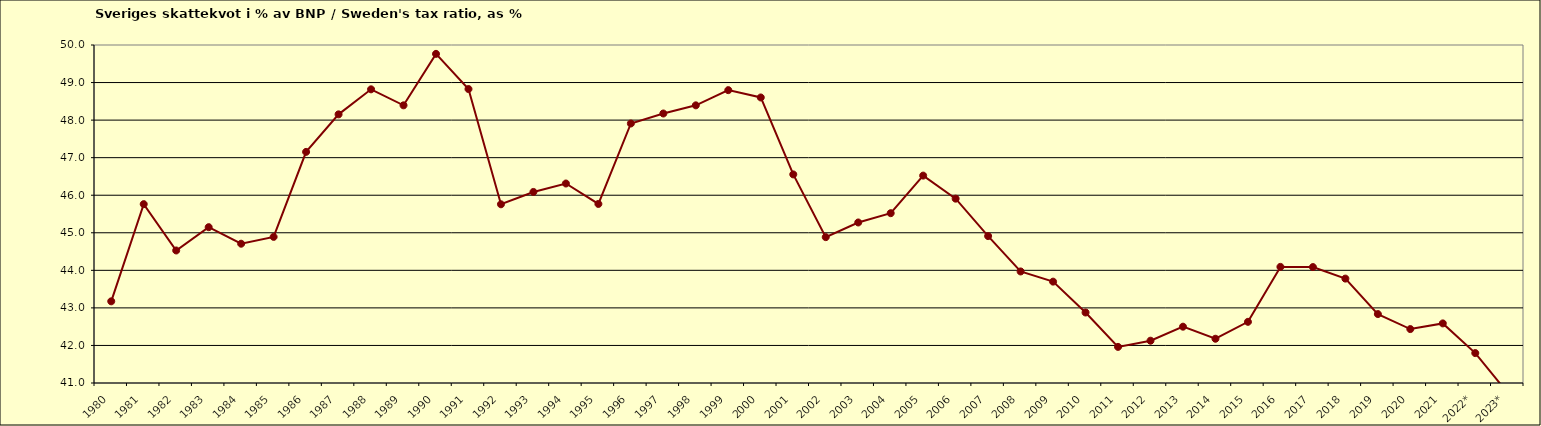
| Category | Series 0 |
|---|---|
| 1980 | 43.175 |
| 1981 | 45.762 |
| 1982 | 44.529 |
| 1983 | 45.149 |
| 1984 | 44.709 |
| 1985 | 44.891 |
| 1986 | 47.154 |
| 1987 | 48.154 |
| 1988 | 48.82 |
| 1989 | 48.394 |
| 1990 | 49.764 |
| 1991 | 48.827 |
| 1992 | 45.758 |
| 1993 | 46.087 |
| 1994 | 46.312 |
| 1995 | 45.767 |
| 1996 | 47.91 |
| 1997 | 48.176 |
| 1998 | 48.393 |
| 1999 | 48.798 |
| 2000 | 48.603 |
| 2001 | 46.554 |
| 2002 | 44.884 |
| 2003 | 45.274 |
| 2004 | 45.522 |
| 2005 | 46.522 |
| 2006 | 45.908 |
| 2007 | 44.912 |
| 2008 | 43.97 |
| 2009 | 43.699 |
| 2010 | 42.877 |
| 2011 | 41.962 |
| 2012 | 42.126 |
| 2013 | 42.5 |
| 2014 | 42.178 |
| 2015 | 42.629 |
| 2016 | 44.092 |
| 2017 | 44.087 |
| 2018 | 43.78 |
| 2019 | 42.836 |
| 2020 | 42.436 |
| 2021 | 42.587 |
| 2022* | 41.797 |
| 2023* | 40.734 |